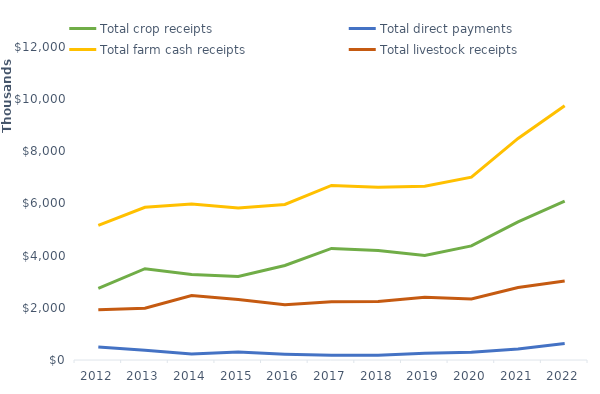
| Category | Total crop receipts | Total direct payments | Total farm cash receipts | Total livestock receipts |
|---|---|---|---|---|
| 2012 | 2745222 | 494635 | 5164996 | 1925138 |
| 2013 | 3501458 | 370949 | 5855259 | 1982852 |
| 2014 | 3275752 | 231201 | 5979450 | 2472497 |
| 2015 | 3200880 | 304505 | 5828780 | 2323395 |
| 2016 | 3621999 | 221804 | 5963263 | 2119460 |
| 2017 | 4276385 | 178141 | 6692046 | 2237519 |
| 2018 | 4201038 | 179575 | 6624897 | 2244284 |
| 2019 | 4005504 | 255093 | 6661588 | 2400991 |
| 2020 | 4373573 | 295489 | 7012226 | 2343164 |
| 2021 | 5295489 | 417907 | 8493978 | 2780582 |
| 2022 | 6090036 | 634270 | 9749233 | 3024927 |